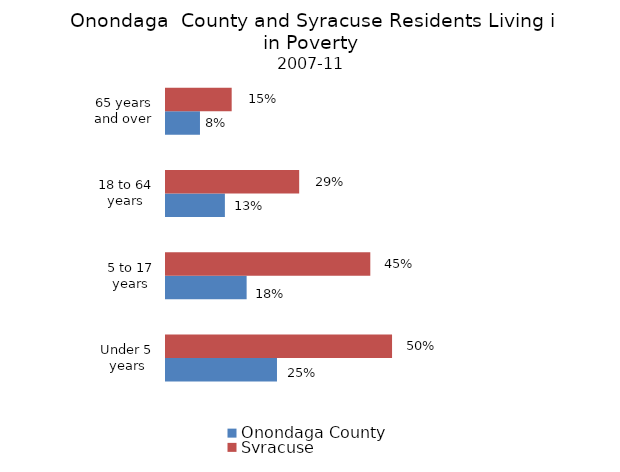
| Category | Onondaga County | Syracuse |
|---|---|---|
| Under 5 years | 0.245 | 0.499 |
| 5 to 17 years | 0.178 | 0.451 |
| 18 to 64 years | 0.13 | 0.294 |
| 65 years and over | 0.075 | 0.145 |